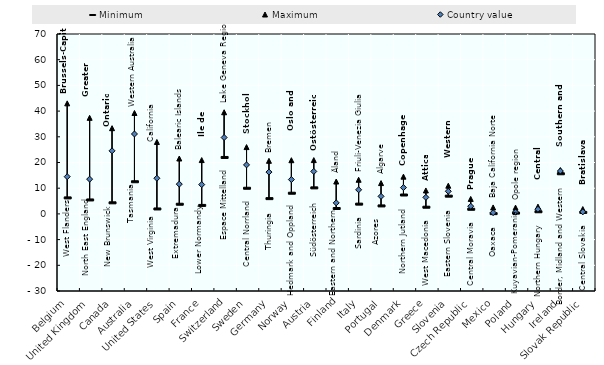
| Category | Minimum | Maximum | Country value |
|---|---|---|---|
| Slovak Republic | 0.577 | 1.883 | 0.783 |
| Ireland | 15.612 | 17.069 | 16.683 |
| Hungary | 0.832 | 2.826 | 1.808 |
| Poland | 0.307 | 2.44 | 0.711 |
| Mexico | 0.106 | 2.517 | 0.484 |
| Czech Republic | 1.802 | 5.825 | 2.989 |
| Slovenia | 6.903 | 10.968 | 8.806 |
| Greece | 2.602 | 9.118 | 6.437 |
| Denmark | 7.349 | 14.486 | 10.234 |
| Portugal | 3.11 | 11.992 | 6.83 |
| Italy | 3.802 | 13.281 | 9.382 |
| Finland | 2.096 | 12.599 | 4.295 |
| Austria | 10.131 | 20.935 | 16.519 |
| Norway | 8.045 | 20.894 | 13.363 |
| Germany | 5.94 | 20.653 | 16.267 |
| Sweden | 9.975 | 25.999 | 19.075 |
| Switzerland | 21.958 | 39.55 | 29.724 |
| France | 3.305 | 20.948 | 11.408 |
| Spain | 3.76 | 21.554 | 11.581 |
| United States | 1.922 | 27.99 | 13.869 |
| Australia | 12.513 | 39.271 | 31.099 |
| Canada | 4.313 | 33.352 | 24.544 |
| United Kingdom | 5.431 | 37.38 | 13.525 |
| Belgium | 6.225 | 43.016 | 14.485 |